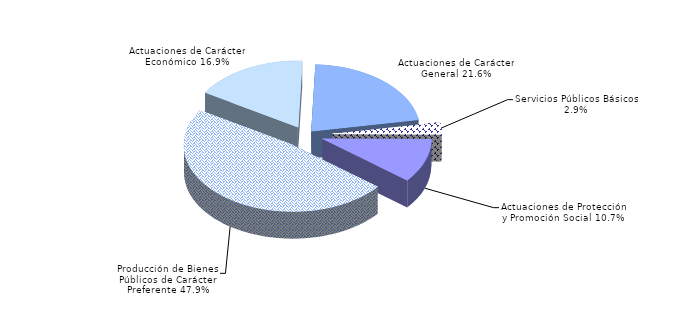
| Category | Series 0 |
|---|---|
| Servicios Públicos Básicos | 2.894 |
| Actuaciones de Protección y Promoción Social | 10.683 |
| Producción de Bienes Públicos de Carácter Preferente | 47.931 |
| Actuaciones de Carácter Económico | 16.885 |
| Actuaciones de Carácter General | 21.606 |